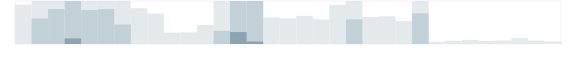
| Category | Безопасность | Series 1 | Series 2 | Series 3 |
|---|---|---|---|---|
| 0.333333333333333 | 685 | 0 | 0 | 0 |
| nan | 750 | 446 | 0 | 0 |
| nan | 750 | 610 | 0 | 0 |
| nan | 750 | 750 | 97 | 0 |
| 0.416666666666667 | 750 | 594 | 0 | 0 |
| nan | 750 | 608 | 0 | 0 |
| nan | 750 | 341 | 0 | 0 |
| nan | 625 | 0 | 0 | 0 |
| 0.5 | 531 | 0 | 0 | 0 |
| nan | 198 | 0 | 0 | 0 |
| nan | 203 | 0 | 0 | 0 |
| nan | 332 | 0 | 0 | 0 |
| 0.583333333333333 | 750 | 229 | 0 | 0 |
| nan | 750 | 750 | 208 | 0 |
| nan | 750 | 750 | 43 | 0 |
| nan | 462 | 0 | 0 | 0 |
| 0.666666666666667 | 447 | 0 | 0 | 0 |
| nan | 490 | 0 | 0 | 0 |
| nan | 429 | 0 | 0 | 0 |
| nan | 683 | 0 | 0 | 0 |
| 0.75 | 750 | 430 | 0 | 0 |
| nan | 471 | 0 | 0 | 0 |
| nan | 483 | 0 | 0 | 0 |
| nan | 400 | 0 | 0 | 0 |
| 0.833333333333333 | 750 | 533 | 0 | 0 |
| nan | 40 | 0 | 0 | 0 |
| nan | 56 | 0 | 0 | 0 |
| nan | 71 | 0 | 0 | 0 |
| 0.916666666666667 | 53 | 0 | 0 | 0 |
| nan | 61 | 0 | 0 | 0 |
| nan | 99 | 0 | 0 | 0 |
| nan | 60 | 0 | 0 | 0 |
| 0.9993055555555556 | 44 | 0 | 0 | 0 |